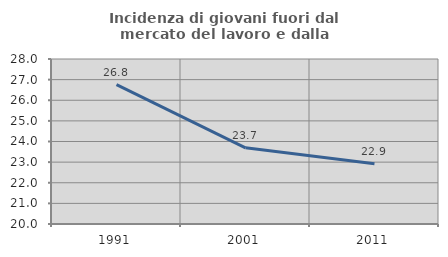
| Category | Incidenza di giovani fuori dal mercato del lavoro e dalla formazione  |
|---|---|
| 1991.0 | 26.757 |
| 2001.0 | 23.694 |
| 2011.0 | 22.916 |